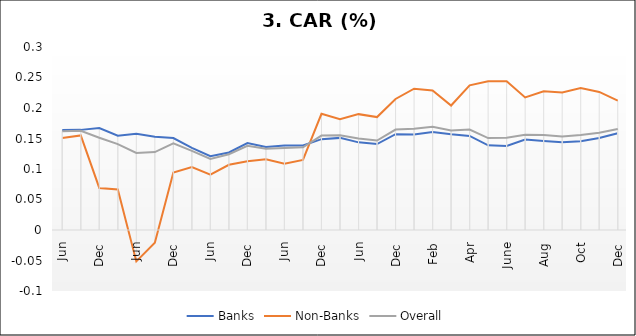
| Category | Banks | Non-Banks | Overall |
|---|---|---|---|
| 0 | 0.164 | 0.151 | 0.162 |
| 1 | 0.164 | 0.155 | 0.163 |
| 2 | 0.167 | 0.069 | 0.151 |
| 3 | 0.155 | 0.067 | 0.141 |
| 4 | 0.158 | -0.051 | 0.126 |
| 5 | 0.153 | -0.021 | 0.128 |
| 6 | 0.151 | 0.094 | 0.142 |
| 7 | 0.135 | 0.103 | 0.13 |
| 8 | 0.121 | 0.091 | 0.116 |
| 9 | 0.127 | 0.107 | 0.124 |
| 10 | 0.142 | 0.113 | 0.138 |
| 11 | 0.136 | 0.116 | 0.133 |
| 12 | 0.139 | 0.109 | 0.134 |
| 13 | 0.139 | 0.115 | 0.136 |
| 14 | 0.149 | 0.191 | 0.155 |
| 15 | 0.151 | 0.182 | 0.156 |
| 16 | 0.144 | 0.19 | 0.15 |
| 17 | 0.141 | 0.185 | 0.147 |
| 18 | 0.157 | 0.215 | 0.165 |
| 19 | 0.156 | 0.232 | 0.166 |
| 20 | 0.161 | 0.229 | 0.169 |
| 21 | 0.157 | 0.204 | 0.163 |
| 22 | 0.154 | 0.237 | 0.165 |
| 23 | 0.139 | 0.244 | 0.151 |
| 24 | 0.138 | 0.244 | 0.151 |
| 25 | 0.148 | 0.217 | 0.156 |
| 26 | 0.146 | 0.228 | 0.156 |
| 27 | 0.144 | 0.226 | 0.153 |
| 28 | 0.146 | 0.233 | 0.156 |
| 29 | 0.151 | 0.226 | 0.16 |
| 30 | 0.159 | 0.212 | 0.166 |